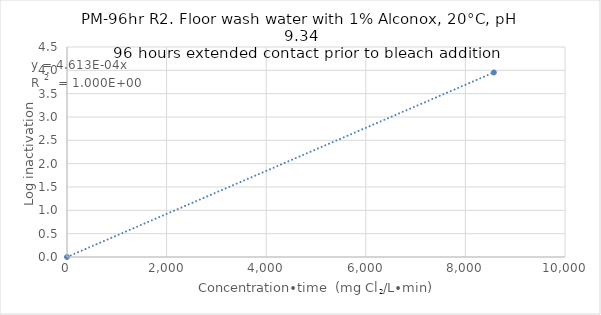
| Category | Series 0 |
|---|---|
| 0.0 | 0 |
| 8571.428571428572 | 3.954 |